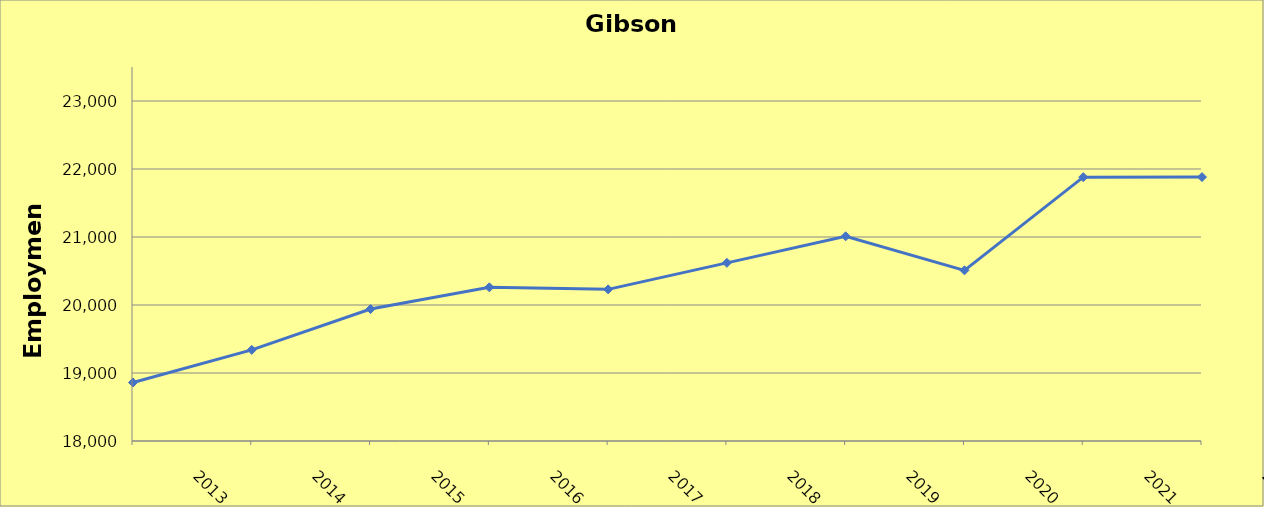
| Category | Gibson County |
|---|---|
| 2013.0 | 18860 |
| 2014.0 | 19340 |
| 2015.0 | 19940 |
| 2016.0 | 20260 |
| 2017.0 | 20230 |
| 2018.0 | 20620 |
| 2019.0 | 21010 |
| 2020.0 | 20510 |
| 2021.0 | 21880 |
| 2022.0 | 21881 |